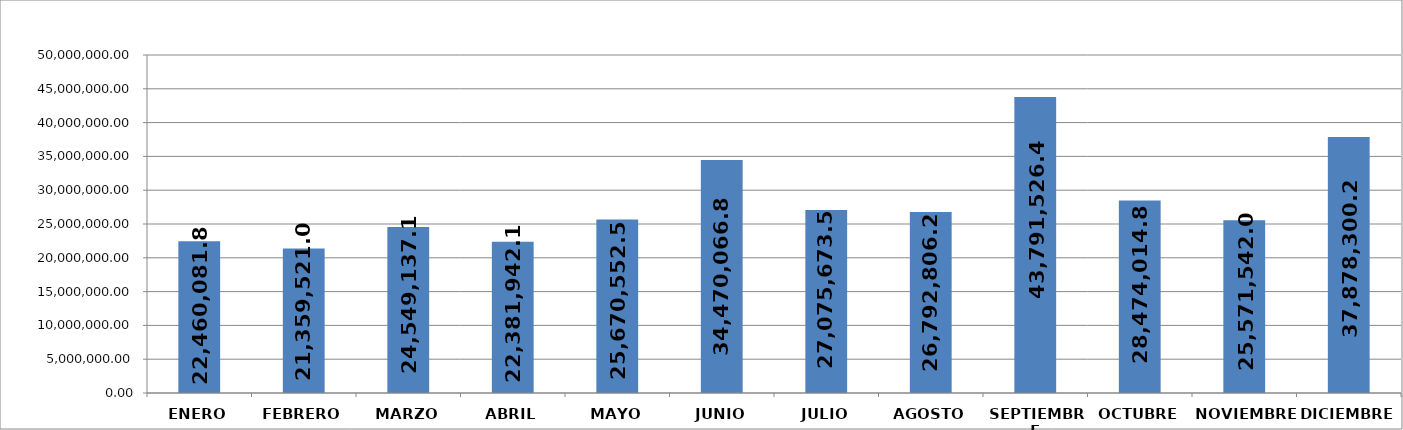
| Category | Series 0 | 22,460,081.85 |
|---|---|---|
| ENERO | 22460081.85 |  |
| FEBRERO | 21359521.04 |  |
| MARZO | 24549137.15 |  |
| ABRIL | 22381942.16 |  |
| MAYO | 25670552.51 |  |
| JUNIO | 34470066.84 |  |
| JULIO | 27075673.58 |  |
| AGOSTO | 26792806.21 |  |
| SEPTIEMBRE | 43791526.42 |  |
| OCTUBRE | 28474014.85 |  |
| NOVIEMBRE | 25571542.07 |  |
| DICIEMBRE | 37878300.23 |  |